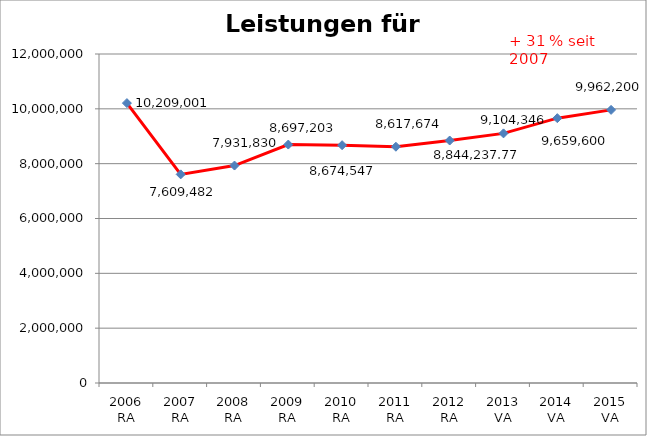
| Category | Leistungen für Personal |
|---|---|
| 2006 RA | 10209001.15 |
| 2007 RA | 7609481.87 |
| 2008 RA | 7931829.63 |
| 2009 RA | 8697202.74 |
| 2010 RA | 8674547.15 |
| 2011 RA | 8617673.89 |
| 2012 RA | 8844237.77 |
| 2013 VA | 9104346 |
| 2014 VA | 9659600 |
| 2015 VA | 9962200 |